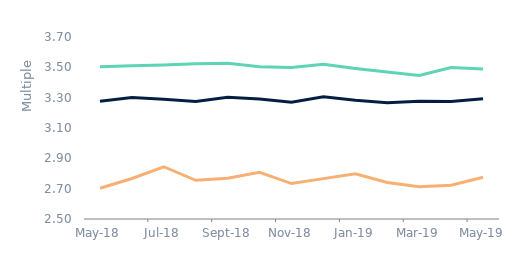
| Category | First-time
buyers | Homemovers | Remortgagors |
|---|---|---|---|
| 2018-05-01 | 3.504 | 3.276 | 2.703 |
| 2018-06-01 | 3.511 | 3.301 | 2.767 |
| 2018-07-01 | 3.515 | 3.29 | 2.845 |
| 2018-08-01 | 3.524 | 3.275 | 2.755 |
| 2018-09-01 | 3.528 | 3.302 | 2.769 |
| 2018-10-01 | 3.504 | 3.292 | 2.808 |
| 2018-11-01 | 3.499 | 3.27 | 2.734 |
| 2018-12-01 | 3.521 | 3.306 | 2.766 |
| 2019-01-01 | 3.493 | 3.283 | 2.798 |
| 2019-02-01 | 3.47 | 3.267 | 2.74 |
| 2019-03-01 | 3.447 | 3.276 | 2.713 |
| 2019-04-01 | 3.499 | 3.274 | 2.722 |
| 2019-05-01 | 3.488 | 3.293 | 2.775 |